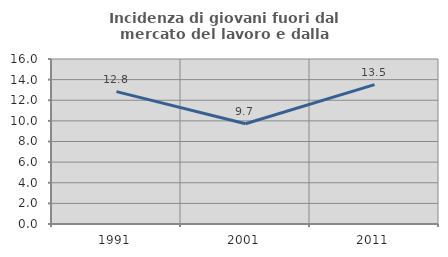
| Category | Incidenza di giovani fuori dal mercato del lavoro e dalla formazione  |
|---|---|
| 1991.0 | 12.838 |
| 2001.0 | 9.722 |
| 2011.0 | 13.514 |